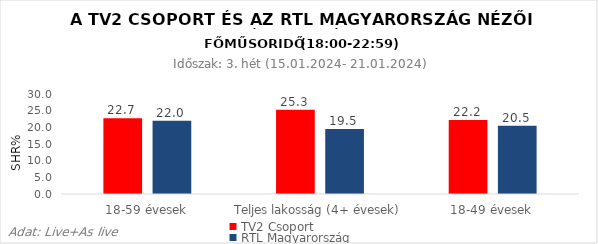
| Category | TV2 Csoport | RTL Magyarország |
|---|---|---|
| 18-59 évesek | 22.7 | 22 |
| Teljes lakosság (4+ évesek) | 25.3 | 19.5 |
| 18-49 évesek | 22.2 | 20.5 |